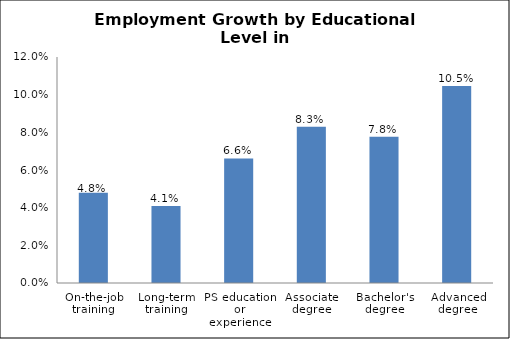
| Category | Series 0 |
|---|---|
| On-the-job training | 0.048 |
| Long-term training | 0.041 |
| PS education or experience | 0.066 |
| Associate degree | 0.083 |
| Bachelor's degree | 0.078 |
| Advanced degree | 0.105 |